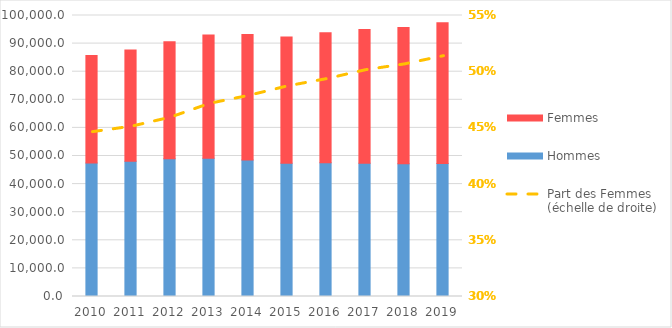
| Category | Hommes | Femmes |
|---|---|---|
| 2010.0 | 47496 | 38274 |
| 2011.0 | 48130 | 39550 |
| 2012.0 | 49052 | 41644 |
| 2013.0 | 49198 | 43881 |
| 2014.0 | 48607 | 44595 |
| 2015.0 | 47394 | 44985 |
| 2016.0 | 47564 | 46323 |
| 2017.0 | 47387 | 47640 |
| 2018.0 | 47226 | 48470 |
| 2019.0 | 47355 | 50048 |